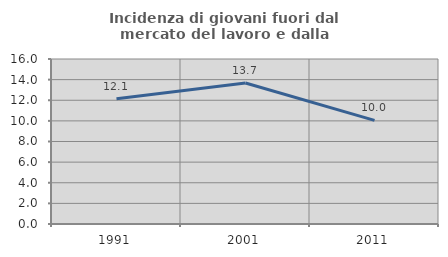
| Category | Incidenza di giovani fuori dal mercato del lavoro e dalla formazione  |
|---|---|
| 1991.0 | 12.139 |
| 2001.0 | 13.672 |
| 2011.0 | 10.044 |